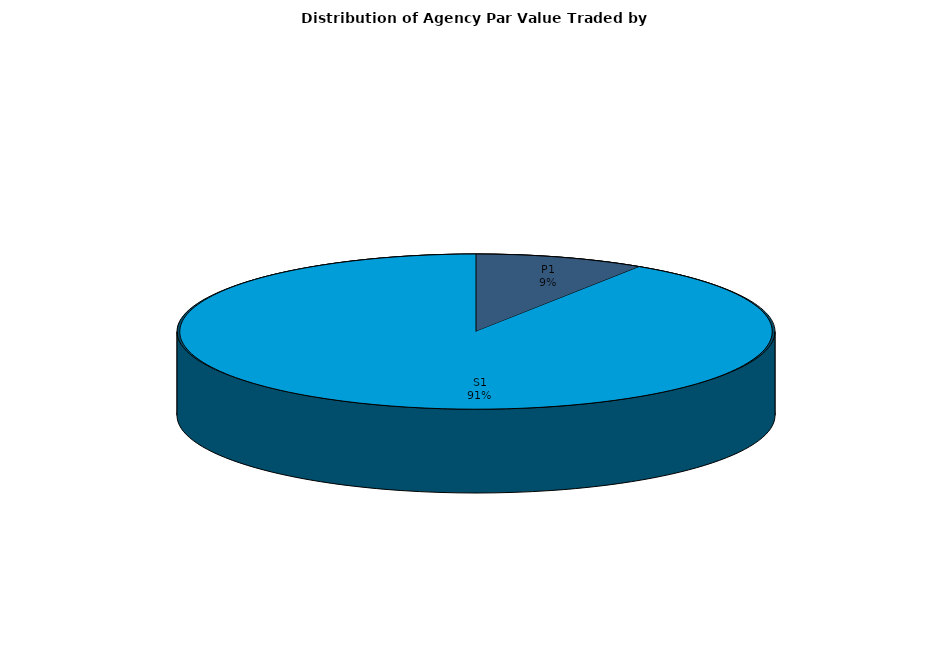
| Category | Series 0 |
|---|---|
| P1 | 739764187.251 |
| S1 | 7289269455.871 |